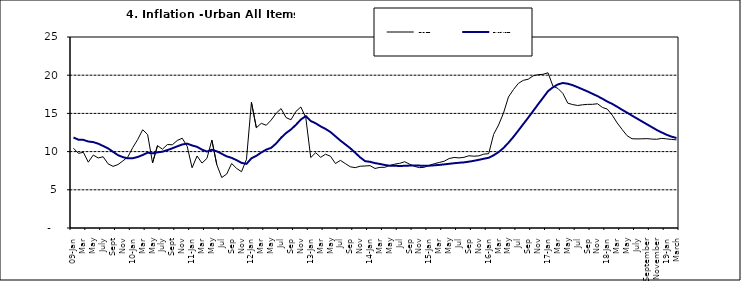
| Category | Year-on Rate | 12-Month Average |
|---|---|---|
| 09-Jan | 10.439 | 11.844 |
| Feb | 9.772 | 11.562 |
| Mar | 9.907 | 11.538 |
| Apr | 8.618 | 11.319 |
| May | 9.547 | 11.246 |
| June | 9.17 | 11.039 |
| July | 9.325 | 10.738 |
| Aug | 8.401 | 10.424 |
| Sept | 8.07 | 9.973 |
| Oct | 8.3 | 9.535 |
| Nov | 8.781 | 9.278 |
| Dec | 9.298 | 9.117 |
| 10-Jan | 10.534 | 9.136 |
| Feb | 11.584 | 9.297 |
| Mar | 12.864 | 9.555 |
| Apr | 12.24 | 9.859 |
| May | 8.524 | 9.769 |
| June | 10.781 | 9.904 |
| July | 10.313 | 9.987 |
| Aug | 10.924 | 10.197 |
| Sept | 10.891 | 10.43 |
| Oct | 11.457 | 10.689 |
| Nov | 11.748 | 10.932 |
| Dec | 10.699 | 11.042 |
| 11-Jan | 7.878 | 10.806 |
| Feb | 9.426 | 10.623 |
| Mar | 8.498 | 10.26 |
| Apr | 9.11 | 10.005 |
| May | 11.5 | 10.249 |
| Jun | 8.278 | 10.034 |
| Jul | 6.608 | 9.711 |
| Aug | 7.061 | 9.38 |
| Sep | 8.443 | 9.178 |
| Oct | 7.802 | 8.88 |
| Nov | 7.365 | 8.525 |
| Dec | 8.993 | 8.395 |
| 12-Jan | 16.445 | 9.119 |
| Feb | 13.123 | 9.443 |
| Mar | 13.701 | 9.889 |
| Apr | 13.447 | 10.259 |
| May | 14.127 | 10.496 |
| Jun | 15.012 | 11.062 |
| Jul | 15.63 | 11.81 |
| Aug | 14.456 | 12.422 |
| Sep | 14.162 | 12.893 |
| Oct | 15.26 | 13.506 |
| Nov | 15.836 | 14.199 |
| Dec | 14.459 | 14.637 |
| 13-Jan | 9.22 | 14.006 |
| Feb | 9.85 | 13.703 |
| Mar | 9.253 | 13.302 |
| Apr | 9.657 | 12.966 |
| May | 9.385 | 12.557 |
| Jun | 8.441 | 11.999 |
| Jul | 8.849 | 11.443 |
| Aug | 8.431 | 10.946 |
| Sep | 8.013 | 10.44 |
| Oct | 7.9 | 9.849 |
| Nov | 8.086 | 9.245 |
| Dec | 8.117 | 8.75 |
| 14-Jan | 8.164 | 8.662 |
| Feb | 7.791 | 8.493 |
| Mar | 7.937 | 8.384 |
| Apr | 7.947 | 8.246 |
| May | 8.195 | 8.151 |
| Jun | 8.358 | 8.146 |
| Jul | 8.464 | 8.118 |
| Aug | 8.673 | 8.141 |
| Sep | 8.357 | 8.17 |
| Oct | 8.064 | 8.182 |
| Nov | 7.902 | 8.165 |
| Dec | 7.948 | 8.151 |
| 15-Jan | 8.211 | 8.155 |
| Feb | 8.412 | 8.206 |
| Mar | 8.579 | 8.26 |
| Apr | 8.742 | 8.326 |
| May | 9.092 | 8.403 |
| Jun | 9.232 | 8.478 |
| Jul | 9.177 | 8.54 |
| Aug | 9.25 | 8.591 |
| Sep | 9.455 | 8.684 |
| Oct | 9.398 | 8.795 |
| Nov | 9.442 | 8.922 |
| Dec | 9.665 | 9.064 |
| 16-Jan | 9.728 | 9.19 |
| Feb | 12.254 | 9.516 |
| Mar | 13.485 | 9.935 |
| Apr | 15.052 | 10.474 |
| May | 17.148 | 11.165 |
| Jun | 18.111 | 11.925 |
| Jul | 18.927 | 12.754 |
| Aug | 19.325 | 13.605 |
| Sep | 19.476 | 14.444 |
| Oct | 19.914 | 15.318 |
| Nov | 20.067 | 16.193 |
| Dec | 20.118 | 17.05 |
| 17-Jan | 20.315 | 17.914 |
| Feb | 18.569 | 18.418 |
| Mar | 18.27 | 18.794 |
| Apr | 17.621 | 18.982 |
| May | 16.343 | 18.883 |
| Jun | 16.153 | 18.692 |
| Jul | 16.038 | 18.43 |
| Aug | 16.128 | 18.151 |
| Sep | 16.183 | 17.872 |
| Oct | 16.187 | 17.567 |
| Nov | 16.267 | 17.264 |
| Dec | 15.785 | 16.921 |
| 18-Jan | 15.559 | 16.55 |
| Feb | 14.763 | 16.241 |
| Mar | 13.748 | 15.866 |
| Apr | 12.893 | 15.468 |
| May | 12.077 | 15.096 |
| June | 11.683 | 14.706 |
| July | 11.661 | 14.329 |
| August | 11.673 | 13.951 |
| September | 11.697 | 13.578 |
| October | 11.64 | 13.206 |
| November | 11.615 | 12.831 |
| December | 11.731 | 12.509 |
| 19-Jan | 11.664 | 12.203 |
| February | 11.592 | 11.954 |
| March | 11.535 | 11.78 |